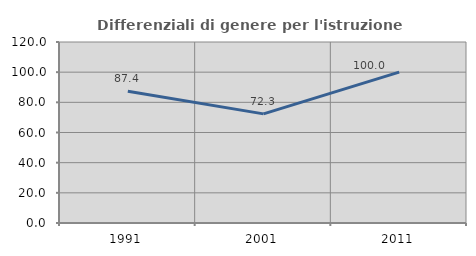
| Category | Differenziali di genere per l'istruzione superiore |
|---|---|
| 1991.0 | 87.368 |
| 2001.0 | 72.336 |
| 2011.0 | 100 |